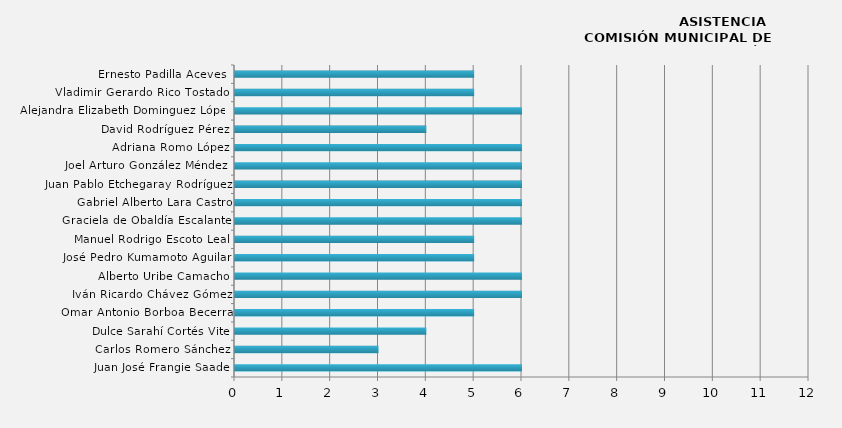
| Category | Series 0 |
|---|---|
| Juan José Frangie Saade | 6 |
| Carlos Romero Sánchez | 3 |
| Dulce Sarahí Cortés Vite | 4 |
| Omar Antonio Borboa Becerra | 5 |
| Iván Ricardo Chávez Gómez | 6 |
| Alberto Uribe Camacho | 6 |
| José Pedro Kumamoto Aguilar | 5 |
| Manuel Rodrigo Escoto Leal | 5 |
| Graciela de Obaldía Escalante | 6 |
| Gabriel Alberto Lara Castro | 6 |
| Juan Pablo Etchegaray Rodríguez | 6 |
| Joel Arturo González Méndez  | 6 |
| Adriana Romo López | 6 |
| David Rodríguez Pérez | 4 |
| Alejandra Elizabeth Dominguez López | 6 |
| Vladimir Gerardo Rico Tostado  | 5 |
| Ernesto Padilla Aceves  | 5 |